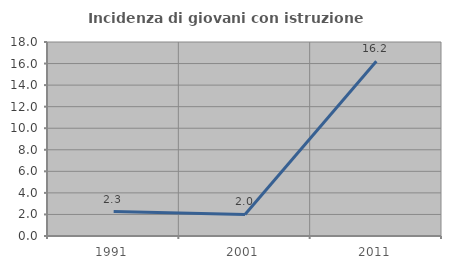
| Category | Incidenza di giovani con istruzione universitaria |
|---|---|
| 1991.0 | 2.273 |
| 2001.0 | 2 |
| 2011.0 | 16.216 |